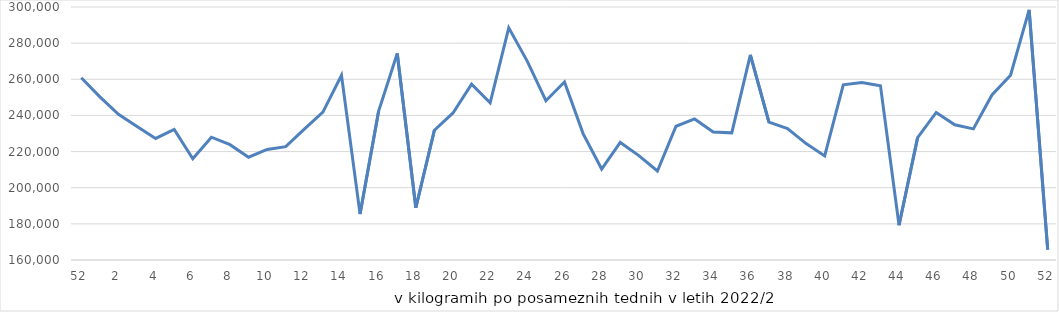
| Category | Series 0 |
|---|---|
| 52.0 | 260874 |
| 1.0 | 250275 |
| 2.0 | 240617 |
| 3.0 | 233858 |
| 4.0 | 227267 |
| 5.0 | 232282 |
| 6.0 | 215979 |
| 7.0 | 227945 |
| 8.0 | 223823 |
| 9.0 | 216883 |
| 10.0 | 221163 |
| 11.0 | 222704 |
| 12.0 | 232375 |
| 13.0 | 241790 |
| 14.0 | 262198 |
| 15.0 | 185395 |
| 16.0 | 242445 |
| 17.0 | 274260 |
| 18.0 | 188916 |
| 19.0 | 231818 |
| 20.0 | 241361 |
| 21.0 | 257321 |
| 22.0 | 246992 |
| 23.0 | 288478 |
| 24.0 | 269910 |
| 25.0 | 248123 |
| 26.0 | 258473 |
| 27.0 | 229943 |
| 28.0 | 210331 |
| 29.0 | 225056 |
| 30.0 | 217771 |
| 31.0 | 209262 |
| 32.0 | 233995 |
| 33.0 | 238076 |
| 34.0 | 230825 |
| 35.0 | 230348 |
| 36.0 | 273520 |
| 37.0 | 236300 |
| 38.0 | 232684 |
| 39.0 | 224422 |
| 40.0 | 217591 |
| 41.0 | 256917 |
| 42.0 | 258180 |
| 43.0 | 256464 |
| 44.0 | 179208 |
| 45.0 | 227719 |
| 46.0 | 241665 |
| 47.0 | 234799 |
| 48.0 | 232543 |
| 49.0 | 251328 |
| 50.0 | 262262 |
| 51.0 | 298408 |
| 52.0 | 165801 |